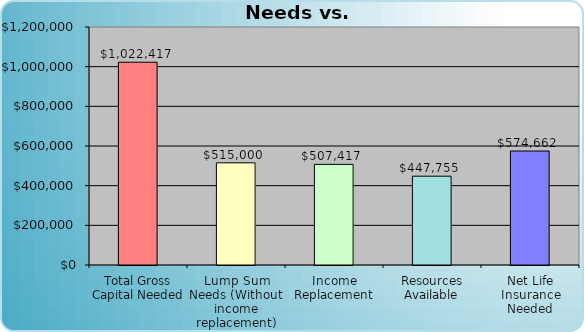
| Category | Series 0 |
|---|---|
| Total Gross Capital Needed | 1022417.276 |
| Lump Sum Needs (Without income replacement) | 515000 |
| Income Replacement | 507417.276 |
| Resources Available | 447755 |
| Net Life Insurance Needed | 574662.276 |